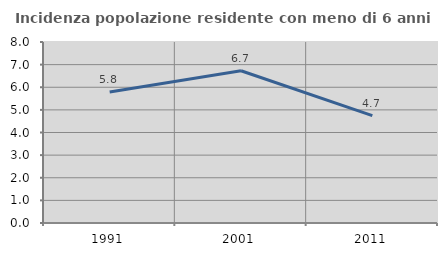
| Category | Incidenza popolazione residente con meno di 6 anni |
|---|---|
| 1991.0 | 5.792 |
| 2001.0 | 6.731 |
| 2011.0 | 4.747 |